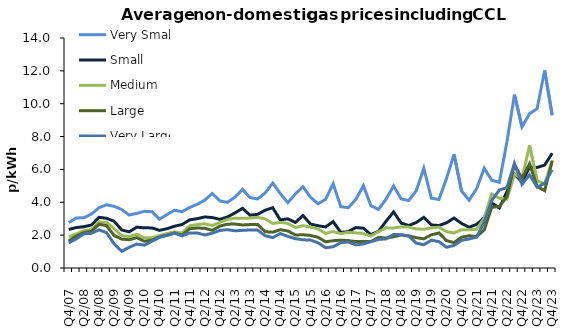
| Category | Very Small | Small | Medium | Large | Very Large |
|---|---|---|---|---|---|
| Q4/07  | 2.766 | 2.344 | 1.894 | 1.644 | 1.536 |
| Q1/08  | 3.045 | 2.463 | 2.073 | 1.95 | 1.774 |
| Q2/08  | 3.061 | 2.513 | 2.287 | 2.15 | 2.086 |
| Q3/08  | 3.282 | 2.617 | 2.344 | 2.23 | 2.11 |
| Q4/08  | 3.67 | 3.086 | 2.795 | 2.664 | 2.32 |
| Q1/09  | 3.847 | 3.026 | 2.787 | 2.578 | 2.152 |
| Q2/09  | 3.753 | 2.846 | 2.394 | 1.978 | 1.469 |
| Q3/09  | 3.559 | 2.318 | 1.971 | 1.759 | 1.021 |
| Q4/09  | 3.224 | 2.202 | 1.911 | 1.722 | 1.261 |
| Q1/10  | 3.325 | 2.486 | 2.052 | 1.847 | 1.455 |
| Q2/10  | 3.449 | 2.444 | 1.839 | 1.629 | 1.39 |
| Q3/10  | 3.428 | 2.441 | 1.847 | 1.693 | 1.624 |
| Q4/10  | 2.973 | 2.292 | 1.973 | 1.887 | 1.866 |
| Q1/11  | 3.251 | 2.393 | 2.098 | 1.998 | 1.986 |
| Q2/11  | 3.517 | 2.545 | 2.208 | 2.133 | 2.122 |
| Q3/11  | 3.427 | 2.647 | 2.125 | 2.001 | 1.959 |
| Q4/11  | 3.687 | 2.93 | 2.57 | 2.386 | 2.127 |
| Q1/12  | 3.877 | 3.001 | 2.639 | 2.437 | 2.132 |
| Q2/12  | 4.129 | 3.109 | 2.694 | 2.414 | 2.012 |
| Q3/12  | 4.538 | 3.07 | 2.58 | 2.294 | 2.116 |
| Q4/12  | 4.082 | 2.962 | 2.775 | 2.549 | 2.286 |
| Q1/13  | 3.998 | 3.102 | 2.96 | 2.667 | 2.334 |
| Q2/13  | 4.309 | 3.352 | 3.032 | 2.676 | 2.262 |
| Q3/13  | 4.787 | 3.632 | 3.029 | 2.621 | 2.292 |
| Q4/13  | 4.284 | 3.213 | 3.039 | 2.643 | 2.314 |
| Q1/14  | 4.201 | 3.268 | 3.084 | 2.653 | 2.307 |
| Q2/14  | 4.568 | 3.517 | 2.987 | 2.207 | 1.965 |
| Q3/14  | 5.172 | 3.668 | 2.71 | 2.181 | 1.85 |
| Q4/14  | 4.534 | 2.927 | 2.777 | 2.331 | 2.096 |
| Q1/15  | 3.975 | 2.992 | 2.711 | 2.255 | 1.923 |
| Q2/15  | 4.511 | 2.772 | 2.467 | 2.01 | 1.783 |
| Q3/15  | 4.949 | 3.198 | 2.578 | 2.024 | 1.716 |
| Q4/15  | 4.311 | 2.677 | 2.489 | 1.983 | 1.701 |
| Q1/16  | 3.907 | 2.572 | 2.377 | 1.867 | 1.534 |
| Q2/16  | 4.181 | 2.499 | 2.104 | 1.596 | 1.235 |
| Q3/16  | 5.134 | 2.824 | 2.218 | 1.661 | 1.293 |
| Q4/16  | 3.735 | 2.17 | 2.093 | 1.697 | 1.545 |
| Q1/17  | 3.665 | 2.212 | 2.169 | 1.671 | 1.584 |
| Q2/17  | 4.175 | 2.462 | 2.142 | 1.608 | 1.406 |
| Q3/17  | 5.014 | 2.424 | 2.087 | 1.619 | 1.467 |
| Q4/17  | 3.791 | 2.03 | 1.946 | 1.606 | 1.602 |
| Q1/18  | 3.567 | 2.235 | 2.209 | 1.865 | 1.741 |
| Q2/18  | 4.191 | 2.843 | 2.445 | 1.824 | 1.77 |
| Q3/18  | 4.994 | 3.416 | 2.435 | 1.901 | 2.043 |
| Q4/18  | 4.21 | 2.735 | 2.507 | 2.014 | 2.024 |
| Q1/19  | 4.102 | 2.587 | 2.487 | 1.956 | 1.945 |
| Q2/19  | 4.704 | 2.767 | 2.374 | 1.845 | 1.514 |
| Q3/19  | 6.073 | 3.085 | 2.361 | 1.775 | 1.417 |
| Q4/19  | 4.252 | 2.623 | 2.439 | 2.021 | 1.692 |
| Q1/20  | 4.167 | 2.583 | 2.489 | 2.131 | 1.609 |
| Q2/20  | 5.442 | 2.75 | 2.212 | 1.667 | 1.263 |
| Q3/20  | 6.913 | 3.041 | 2.134 | 1.542 | 1.375 |
| Q4/20  | 4.689 | 2.712 | 2.333 | 1.877 | 1.686 |
| Q1/21  | 4.121 | 2.481 | 2.336 | 1.963 | 1.769 |
| Q2/21  | 4.834 | 2.658 | 2.356 | 1.908 | 1.881 |
| Q3/21  | 6.072 | 3.055 | 3.041 | 2.321 | 2.817 |
| Q4/21  | 5.341 | 3.953 | 4.514 | 3.69 | 4.115 |
| Q1/22  | 5.212 | 3.653 | 4.24 | 3.746 | 4.746 |
| Q2/22  | 7.669 | 4.64 | 4.192 | 4.342 | 4.895 |
| Q3/22  | 10.549 | 5.709 | 5.706 | 6.294 | 6.366 |
| Q4/22  | 8.59 | 5.238 | 5.437 | 5.457 | 5.09 |
| Q1/23  | 9.397 | 6.137 | 7.474 | 6.348 | 5.677 |
| Q2/23  | 9.697 | 6.12 | 5.316 | 4.968 | 4.92 |
| Q3/23  | 12.023 | 6.265 | 5.113 | 4.708 | 5.156 |
| Q4/23  | 9.297 | 6.99 | 6.571 | 6.512 | 5.983 |